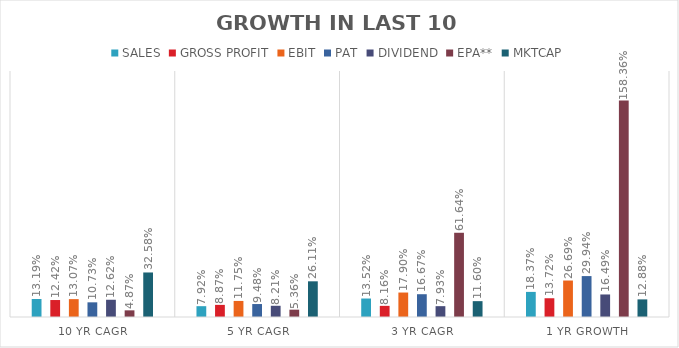
| Category | SALES | GROSS PROFIT | EBIT | PAT | DIVIDEND | EPA** | MKTCAP |
|---|---|---|---|---|---|---|---|
| 10 YR CAGR | 0.132 | 0.124 | 0.131 | 0.107 | 0.126 | 0.049 | 0.326 |
| 5 YR CAGR | 0.079 | 0.089 | 0.118 | 0.095 | 0.082 | 0.054 | 0.261 |
| 3 YR CAGR | 0.135 | 0.082 | 0.179 | 0.167 | 0.079 | 0.616 | 0.116 |
| 1 YR GROWTH | 0.184 | 0.137 | 0.267 | 0.299 | 0.165 | 1.584 | 0.129 |